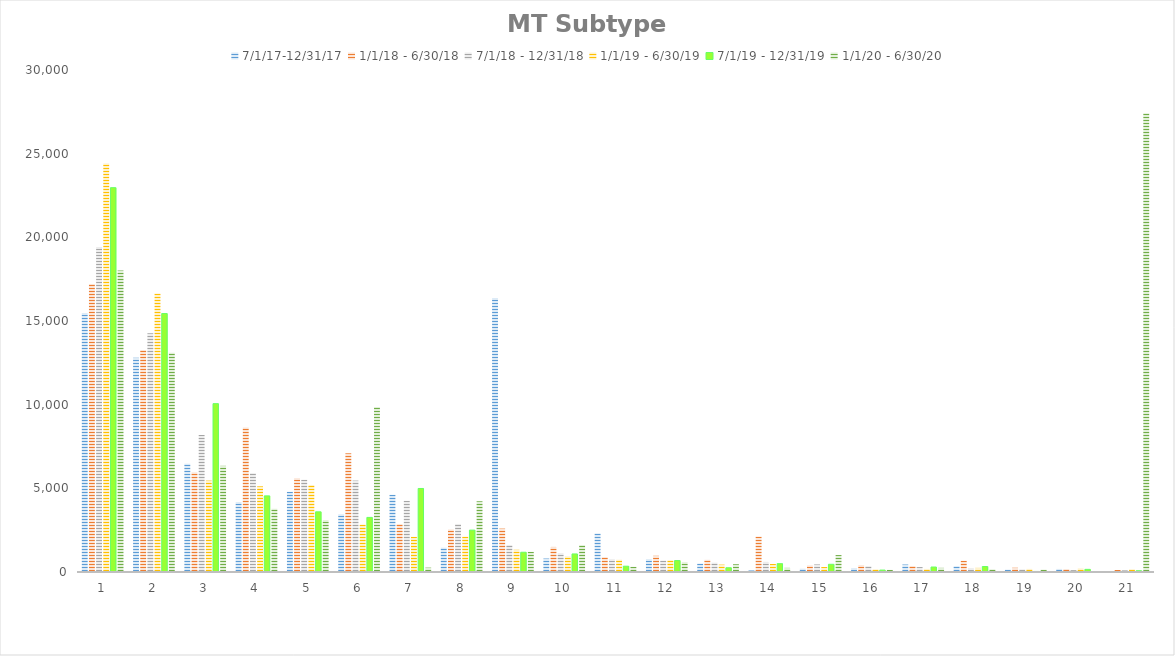
| Category | 7/1/17-12/31/17 | 1/1/18 - 6/30/18 | 7/1/18 - 12/31/18 | 1/1/19 - 6/30/19 | 7/1/19 - 12/31/19 | 1/1/20 - 6/30/20 |
|---|---|---|---|---|---|---|
| 1 | 15477 | 17215 | 19422 | 24408 | 22969 | 18013 |
| 2 | 12810 | 13262 | 14270 | 16636 | 15447 | 13096 |
| 3 | 6472 | 5955 | 8188 | 5463 | 10062 | 6345 |
| 4 | 4178 | 8641 | 5907 | 5119 | 4550 | 3779 |
| 5 | 4794 | 5606 | 5514 | 5198 | 3596 | 3100 |
| 6 | 3449 | 7093 | 5464 | 2836 | 3262 | 9857 |
| 7 | 4615 | 2864 | 4252 | 2104 | 4991 | 261 |
| 8 | 1454 | 2543 | 2871 | 2118 | 2504 | 4227 |
| 9 | 16374 | 2593 | 1612 | 1328 | 1180 | 1204 |
| 10 | 805 | 1498 | 1125 | 936 | 1079 | 1607 |
| 11 | 2307 | 888 | 767 | 735 | 346 | 312 |
| 12 | 771 | 969 | 687 | 702 | 685 | 586 |
| 13 | 505 | 730 | 559 | 441 | 254 | 464 |
| 14 | 93 | 2119 | 600 | 477 | 498 | 247 |
| 15 | 201 | 393 | 453 | 296 | 461 | 1012 |
| 16 | 235 | 408 | 353 | 164 | 114 | 127 |
| 17 | 448 | 356 | 294 | 186 | 297 | 248 |
| 18 | 350 | 677 | 235 | 246 | 327 | 159 |
| 19 | 143 | 254 | 160 | 187 | 32 | 141 |
| 20 | 184 | 176 | 112 | 217 | 157 | 22 |
| 21 | 60 | 118 | 98 | 163 | 76 | 27412 |